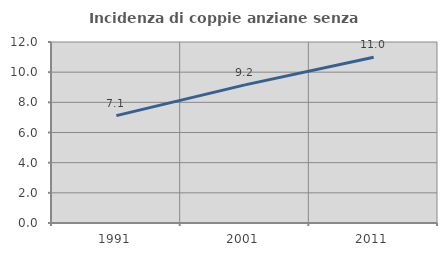
| Category | Incidenza di coppie anziane senza figli  |
|---|---|
| 1991.0 | 7.117 |
| 2001.0 | 9.159 |
| 2011.0 | 10.984 |